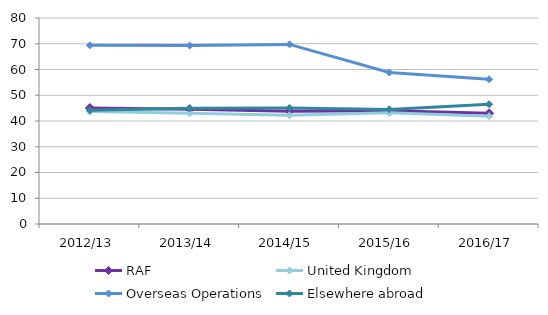
| Category | RAF | United Kingdom | Overseas Operations | Elsewhere abroad |
|---|---|---|---|---|
| 2012/13 | 45.039 | 43.665 | 69.395 | 44.173 |
| 2013/14 | 44.609 | 43.005 | 69.297 | 44.922 |
| 2014/15 | 43.826 | 42.219 | 69.756 | 45.051 |
| 2015/16 | 43.935 | 43.167 | 58.827 | 44.495 |
| 2016/17 | 42.993 | 41.891 | 56.197 | 46.528 |